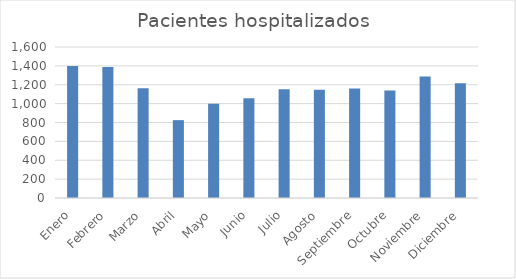
| Category | Pacientes hospitalizados |
|---|---|
| Enero | 1399 |
| Febrero | 1387 |
| Marzo | 1164 |
| Abril | 825 |
| Mayo | 999 |
| Junio | 1058 |
| Julio | 1151 |
| Agosto | 1146 |
| Septiembre | 1160 |
| Octubre | 1138 |
| Noviembre | 1288 |
| Diciembre | 1217 |